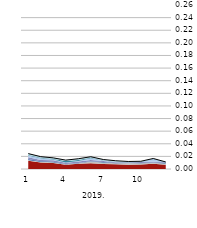
| Category | ПСС |
|---|---|
| 0 | 0.024 |
| 1 | 0.02 |
| 2 | 0.018 |
| 3 | 0.014 |
| 4 | 0.016 |
| 5 | 0.019 |
| 6 | 0.015 |
| 7 | 0.013 |
| 8 | 0.012 |
| 9 | 0.012 |
| 10 | 0.017 |
| 11 | 0.011 |